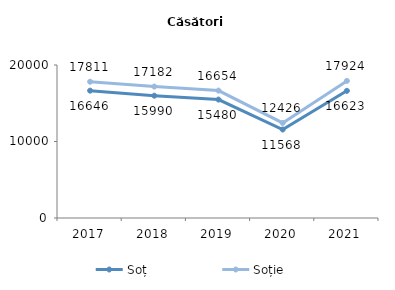
| Category | Soț | Soție |
|---|---|---|
| 2017.0 | 16646 | 17811 |
| 2018.0 | 15990 | 17182 |
| 2019.0 | 15480 | 16654 |
| 2020.0 | 11568 | 12426 |
| 2021.0 | 16623 | 17924 |